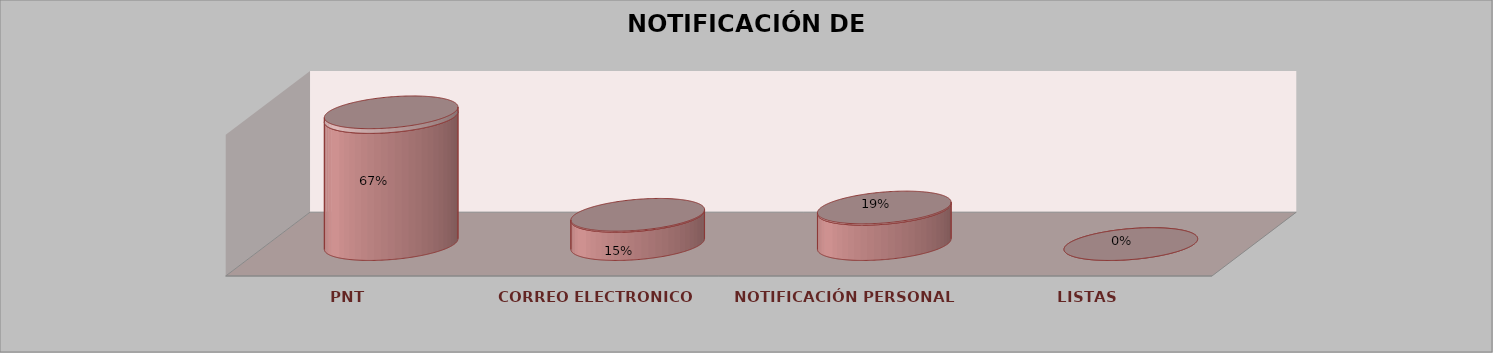
| Category | Series 0 | Series 1 | Series 2 | Series 3 | Series 4 |
|---|---|---|---|---|---|
| PNT |  |  |  | 18 | 0.667 |
| CORREO ELECTRONICO |  |  |  | 4 | 0.148 |
| NOTIFICACIÓN PERSONAL |  |  |  | 5 | 0.185 |
| LISTAS |  |  |  | 0 | 0 |